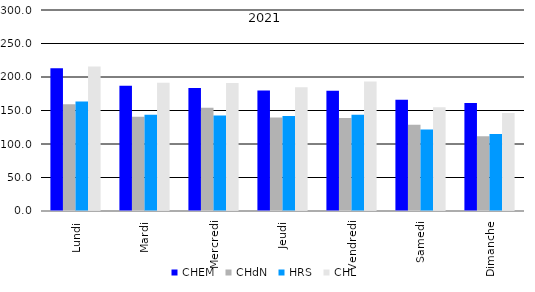
| Category | CHEM  | CHdN  | HRS  | CHL  |
|---|---|---|---|---|
| Lundi | 213.058 | 159.462 | 163.5 | 215.75 |
| Mardi | 187.058 | 140.654 | 143.577 | 191.5 |
| Mercredi | 183.558 | 153.962 | 142.577 | 191.019 |
| Jeudi | 179.712 | 139.596 | 141.731 | 184.654 |
| Vendredi | 179.491 | 138.717 | 143.811 | 193.226 |
| Samedi | 166.115 | 128.731 | 121.827 | 154.981 |
| Dimanche | 161.288 | 111.423 | 115 | 146.365 |